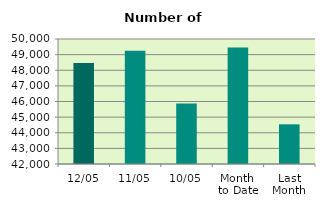
| Category | Series 0 |
|---|---|
| 12/05 | 48466 |
| 11/05 | 49254 |
| 10/05 | 45872 |
| Month 
to Date | 49455.778 |
| Last
Month | 44538 |